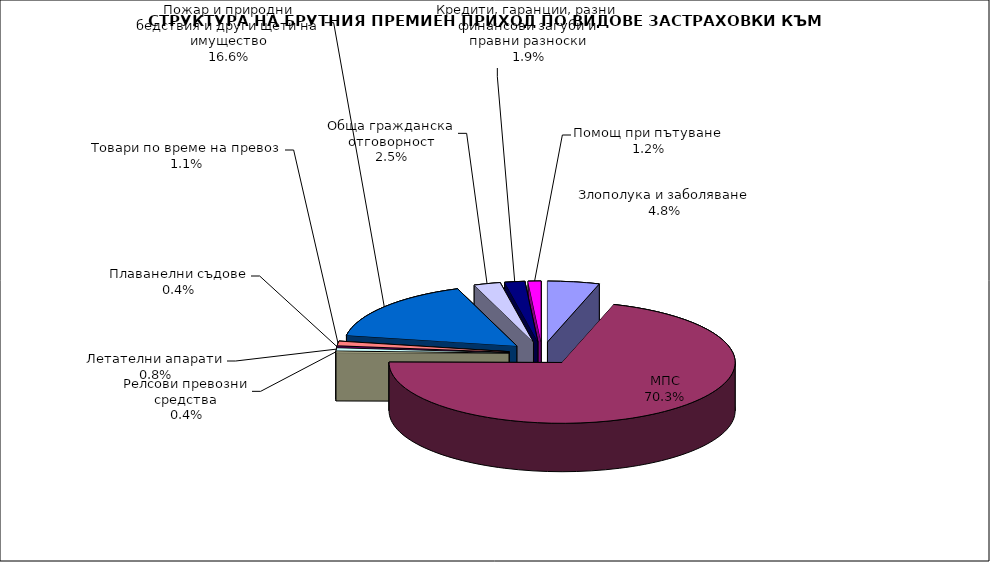
| Category | Злополука и заболяване МПС Релсови превозни средства Летателни апарати Плаванелни съдове Товари по време на превоз Пожар и природни бедствия и други щети на имущество Обща гражданска отговорност Кредити, гаранции, разни финансови загуби и правни разноски  |
|---|---|
| Злополука и заболяване | 0.048 |
| МПС | 0.703 |
| Релсови превозни средства | 0.004 |
| Летателни апарати | 0.008 |
| Плаванелни съдове | 0.004 |
| Товари по време на превоз | 0.011 |
| Пожар и природни бедствия и други щети на имущество | 0.166 |
| Обща гражданска отговорност | 0.025 |
| Кредити, гаранции, разни финансови загуби и правни разноски | 0.019 |
| Помощ при пътуване | 0.012 |